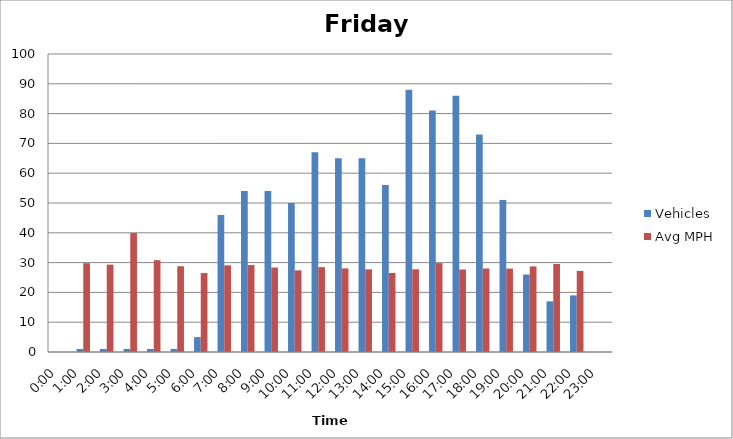
| Category | Vehicles | Avg MPH |
|---|---|---|
| 0:00 | 0 | 0 |
| 1:00 | 1 | 29.8 |
| 2:00 | 1 | 29.31 |
| 3:00 | 1 | 39.92 |
| 4:00 | 1 | 30.8 |
| 5:00 | 1 | 28.78 |
| 6:00 | 5 | 26.49 |
| 7:00 | 46 | 29.08 |
| 8:00 | 54 | 29.18 |
| 9:00 | 54 | 28.35 |
| 10:00 | 50 | 27.41 |
| 11:00 | 67 | 28.47 |
| 12:00 | 65 | 28.06 |
| 13:00 | 65 | 27.73 |
| 14:00 | 56 | 26.53 |
| 15:00 | 88 | 27.76 |
| 16:00 | 81 | 29.82 |
| 17:00 | 86 | 27.68 |
| 18:00 | 73 | 28.01 |
| 19:00 | 51 | 27.98 |
| 20:00 | 26 | 28.72 |
| 21:00 | 17 | 29.54 |
| 22:00 | 19 | 27.22 |
| 23:00 | 0 | 0 |